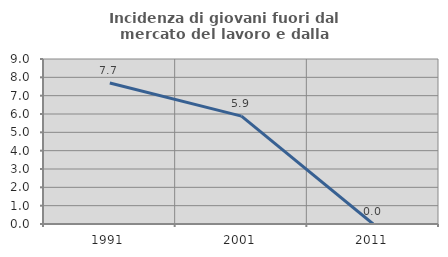
| Category | Incidenza di giovani fuori dal mercato del lavoro e dalla formazione  |
|---|---|
| 1991.0 | 7.692 |
| 2001.0 | 5.882 |
| 2011.0 | 0 |